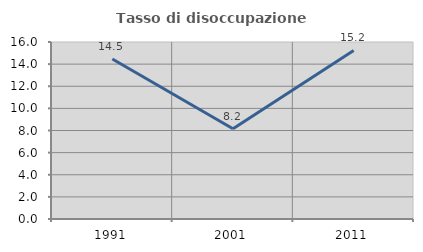
| Category | Tasso di disoccupazione giovanile  |
|---|---|
| 1991.0 | 14.463 |
| 2001.0 | 8.157 |
| 2011.0 | 15.234 |